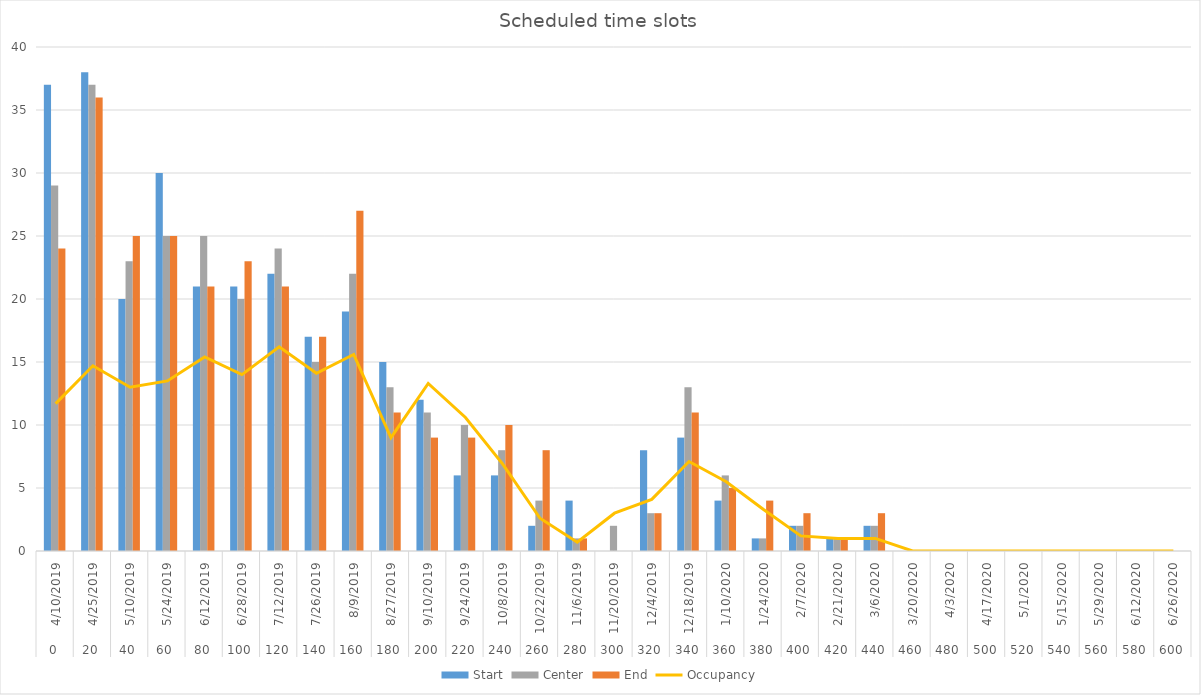
| Category | Start | Center | End |
|---|---|---|---|
| 0 | 37 | 29 | 24 |
| 1 | 38 | 37 | 36 |
| 2 | 20 | 23 | 25 |
| 3 | 30 | 25 | 25 |
| 4 | 21 | 25 | 21 |
| 5 | 21 | 20 | 23 |
| 6 | 22 | 24 | 21 |
| 7 | 17 | 15 | 17 |
| 8 | 19 | 22 | 27 |
| 9 | 15 | 13 | 11 |
| 10 | 12 | 11 | 9 |
| 11 | 6 | 10 | 9 |
| 12 | 6 | 8 | 10 |
| 13 | 2 | 4 | 8 |
| 14 | 4 | 1 | 1 |
| 15 | 0 | 2 | 0 |
| 16 | 8 | 3 | 3 |
| 17 | 9 | 13 | 11 |
| 18 | 4 | 6 | 5 |
| 19 | 1 | 1 | 4 |
| 20 | 2 | 2 | 3 |
| 21 | 1 | 1 | 1 |
| 22 | 2 | 2 | 3 |
| 23 | 0 | 0 | 0 |
| 24 | 0 | 0 | 0 |
| 25 | 0 | 0 | 0 |
| 26 | 0 | 0 | 0 |
| 27 | 0 | 0 | 0 |
| 28 | 0 | 0 | 0 |
| 29 | 0 | 0 | 0 |
| 30 | 0 | 0 | 0 |